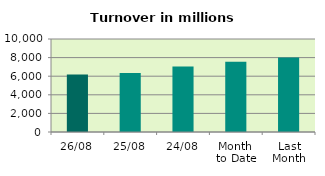
| Category | Series 0 |
|---|---|
| 26/08 | 6190.312 |
| 25/08 | 6332.731 |
| 24/08 | 7048.787 |
| Month 
to Date | 7546.995 |
| Last
Month | 8019.786 |